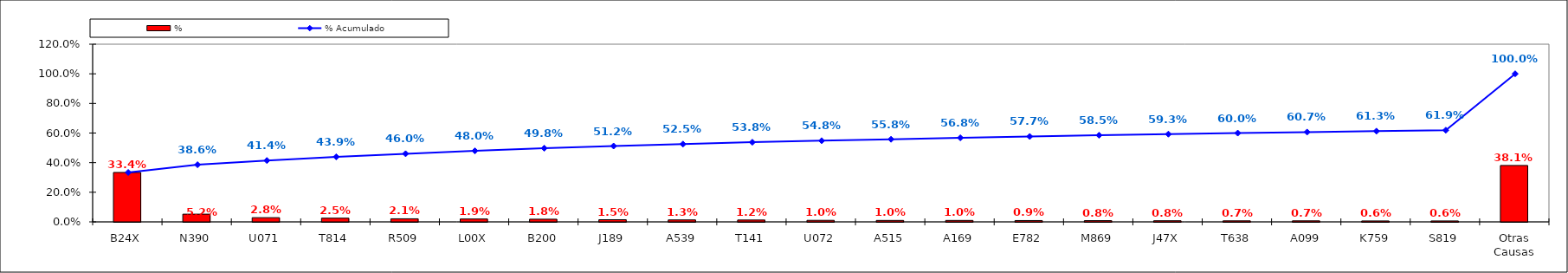
| Category | % |
|---|---|
| B24X | 0.334 |
| N390 | 0.052 |
| U071 | 0.028 |
| T814 | 0.025 |
| R509 | 0.021 |
| L00X | 0.019 |
| B200 | 0.018 |
| J189 | 0.015 |
| A539 | 0.013 |
| T141 | 0.012 |
| U072 | 0.01 |
| A515 | 0.01 |
| A169 | 0.01 |
| E782 | 0.009 |
| M869 | 0.008 |
| J47X | 0.008 |
| T638 | 0.007 |
| A099 | 0.007 |
| K759 | 0.006 |
| S819 | 0.006 |
| Otras Causas | 0.381 |